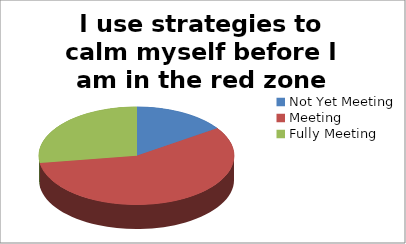
| Category | I use strategies to calm myself before I am in the red zone |
|---|---|
| Not Yet Meeting | 13 |
| Meeting | 48 |
| Fully Meeting | 23 |